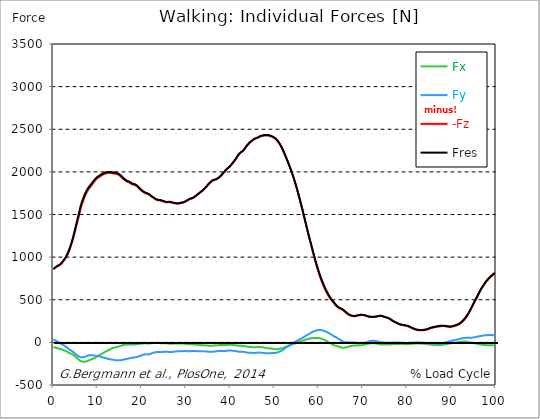
| Category |  Fx |  Fy |  -Fz |  Fres |
|---|---|---|---|---|
| 0.0 | -53.86 | 35.7 | 858.32 | 861.93 |
| 0.1647276845464841 | -56.61 | 30.84 | 865.24 | 868.71 |
| 0.3294553690929682 | -59.45 | 26.04 | 871.29 | 874.8 |
| 0.5044785339236075 | -62.16 | 21.47 | 878.05 | 881.61 |
| 0.6692062184700917 | -64.8 | 17 | 885.11 | 888.73 |
| 0.8339339030165757 | -67.29 | 11.73 | 890.66 | 894.36 |
| 0.9986615875630598 | -69.61 | 6.05 | 896.05 | 899.89 |
| 1.1633892721095438 | -71.93 | 0.19 | 900.86 | 904.81 |
| 1.3384124369401833 | -73.68 | -4.69 | 904.4 | 908.5 |
| 1.5031401214866673 | -75.67 | -9.22 | 909.85 | 914.18 |
| 1.6678678060331513 | -77.93 | -14.22 | 916.52 | 921.11 |
| 1.8325954905796356 | -80.8 | -19.09 | 924.65 | 929.49 |
| 1.9973231751261196 | -84.22 | -23.05 | 935.83 | 940.97 |
| 2.1620508596726036 | -88.34 | -27.77 | 947.15 | 952.63 |
| 2.337074024503243 | -92.35 | -33.05 | 958.51 | 964.37 |
| 2.501801709049727 | -96.06 | -38.92 | 970.1 | 976.39 |
| 2.666529393596211 | -99.51 | -45.11 | 981.97 | 988.69 |
| 2.8312570781426953 | -103.22 | -51.71 | 995.38 | 1002.7 |
| 2.9959847626891793 | -107 | -58.41 | 1009.56 | 1017.52 |
| 3.1710079275198186 | -111.03 | -65.02 | 1026.88 | 1035.52 |
| 3.3357356120663026 | -115.9 | -72.35 | 1047.24 | 1056.63 |
| 3.500463296612787 | -121.27 | -80.82 | 1067.57 | 1077.87 |
| 3.665190981159271 | -125.32 | -86.28 | 1091.03 | 1101.96 |
| 3.8299186657057547 | -128.54 | -90.71 | 1115.15 | 1126.6 |
| 4.004941830536394 | -131.88 | -95.23 | 1140.01 | 1152 |
| 4.169669515082878 | -135.39 | -99.82 | 1165.99 | 1178.53 |
| 4.334397199629363 | -140.22 | -106.33 | 1195.18 | 1208.54 |
| 4.499124884175846 | -146.07 | -114.11 | 1226.6 | 1241 |
| 4.663852568722331 | -153.48 | -122.36 | 1259.73 | 1275.43 |
| 4.8285802532688145 | -160.64 | -129.9 | 1293.23 | 1310.11 |
| 5.003603418099454 | -168.5 | -137.03 | 1328.29 | 1346.44 |
| 5.168331102645938 | -177.04 | -144.72 | 1363.5 | 1383.03 |
| 5.333058787192422 | -184.18 | -150.55 | 1396.71 | 1417.29 |
| 5.497786471738906 | -191.23 | -155.72 | 1429.99 | 1451.57 |
| 5.662514156285391 | -198.05 | -160.57 | 1463.15 | 1485.66 |
| 5.83753732111603 | -205.17 | -165.88 | 1497.69 | 1521.19 |
| 6.0022650056625135 | -213.39 | -171.7 | 1537.04 | 1561.61 |
| 6.166992690208998 | -219.92 | -175.82 | 1572.26 | 1597.65 |
| 6.331720374755482 | -223.09 | -176.34 | 1601.04 | 1626.51 |
| 6.496448059301967 | -225.51 | -175.91 | 1627.23 | 1652.61 |
| 6.671471224132605 | -226.65 | -174.37 | 1651.07 | 1676.18 |
| 6.836198908679089 | -227.15 | -172.96 | 1675 | 1699.7 |
| 7.000926593225574 | -227.78 | -171.74 | 1699.38 | 1723.71 |
| 7.165654277772057 | -227.07 | -169.28 | 1720.34 | 1744.04 |
| 7.330381962318542 | -224.96 | -165.61 | 1738.13 | 1760.97 |
| 7.495109646865026 | -221.86 | -160.8 | 1755.15 | 1776.93 |
| 7.670132811695664 | -218.85 | -156.48 | 1771.79 | 1792.59 |
| 7.8348604962421495 | -216.13 | -153.73 | 1787.13 | 1807.22 |
| 7.999588180788634 | -212.69 | -152.15 | 1800.79 | 1820.23 |
| 8.164315865335118 | -208.76 | -151.47 | 1812.64 | 1831.5 |
| 8.329043549881602 | -204.94 | -150.82 | 1822.72 | 1841.04 |
| 8.504066714712243 | -201.36 | -150.86 | 1833.21 | 1851.08 |
| 8.668794399258726 | -197.91 | -151.55 | 1844.83 | 1862.31 |
| 8.833522083805208 | -194.22 | -151.83 | 1857.53 | 1874.52 |
| 8.998249768351693 | -190.71 | -153.18 | 1870.16 | 1886.78 |
| 9.162977452898177 | -187.16 | -154.67 | 1882.15 | 1898.44 |
| 9.338000617728817 | -183.28 | -155.65 | 1893.23 | 1909.13 |
| 9.5027283022753 | -179.01 | -156.24 | 1903.3 | 1918.76 |
| 9.667455986821786 | -174.47 | -157.31 | 1912.75 | 1927.81 |
| 9.83218367136827 | -169.15 | -158.36 | 1920.73 | 1935.36 |
| 9.996911355914754 | -163.6 | -159.59 | 1927.75 | 1941.98 |
| 10.171934520745392 | -158 | -161 | 1934.03 | 1947.91 |
| 10.336662205291876 | -152.45 | -162.64 | 1940.13 | 1953.68 |
| 10.501389889838359 | -147 | -164.57 | 1946.15 | 1959.39 |
| 10.666117574384844 | -141.86 | -167.35 | 1951.88 | 1964.93 |
| 10.830845258931328 | -136.86 | -170.53 | 1957.3 | 1970.22 |
| 10.995572943477812 | -131.8 | -173.43 | 1962.37 | 1975.15 |
| 11.170596108308452 | -126.73 | -176.07 | 1967.22 | 1979.86 |
| 11.335323792854936 | -121.64 | -178.5 | 1972.03 | 1984.51 |
| 11.50005147740142 | -116.83 | -180.47 | 1975.85 | 1988.19 |
| 11.664779161947905 | -112.39 | -182.82 | 1979.1 | 1991.36 |
| 11.829506846494388 | -108.1 | -185.56 | 1982.27 | 1994.5 |
| 12.004530011325027 | -103.84 | -188.52 | 1984.29 | 1996.56 |
| 12.169257695871512 | -99.21 | -191.12 | 1985.66 | 1997.92 |
| 12.333985380417996 | -94.62 | -193.51 | 1986.71 | 1998.95 |
| 12.498713064964479 | -89.83 | -195.63 | 1987.39 | 1999.58 |
| 12.663440749510965 | -85.07 | -197.51 | 1987.69 | 1999.8 |
| 12.838463914341604 | -80.75 | -198.87 | 1987.41 | 1999.45 |
| 13.003191598888087 | -76.7 | -199.73 | 1986.49 | 1998.43 |
| 13.167919283434573 | -72.71 | -201.24 | 1984.9 | 1996.83 |
| 13.332646967981058 | -68.95 | -201.9 | 1983.16 | 1995.01 |
| 13.497374652527538 | -65.56 | -203.42 | 1981.61 | 1993.5 |
| 13.662102337074025 | -63.18 | -205.41 | 1980.59 | 1992.6 |
| 13.837125501904662 | -61.22 | -207.39 | 1980.16 | 1992.3 |
| 14.001853186451148 | -59.41 | -208.13 | 1978.93 | 1991.11 |
| 14.166580870997631 | -57.5 | -208.8 | 1977.45 | 1989.64 |
| 14.331308555544114 | -55.1 | -209.53 | 1975.12 | 1987.33 |
| 14.4960362400906 | -53.1 | -209.02 | 1972.05 | 1984.16 |
| 14.671059404921238 | -51.17 | -209.53 | 1968.25 | 1980.38 |
| 14.835787089467724 | -47.49 | -209.74 | 1962.68 | 1974.74 |
| 15.000514774014206 | -43.6 | -209.88 | 1956.8 | 1968.79 |
| 15.165242458560689 | -41.46 | -209.39 | 1949.6 | 1961.53 |
| 15.329970143107175 | -39.32 | -208.89 | 1942.39 | 1954.26 |
| 15.504993307937815 | -36.43 | -207.26 | 1933.21 | 1944.9 |
| 15.669720992484299 | -33.69 | -205.46 | 1924.17 | 1935.66 |
| 15.834448677030782 | -31.39 | -202.92 | 1916.23 | 1927.44 |
| 15.999176361577268 | -29.3 | -200 | 1909.02 | 1919.93 |
| 16.16390404612375 | -26.81 | -197.85 | 1902.15 | 1912.83 |
| 16.33892721095439 | -25.21 | -196 | 1895.86 | 1906.36 |
| 16.503654895500876 | -24.72 | -194.4 | 1890.03 | 1900.39 |
| 16.668382580047357 | -24.73 | -193.09 | 1885.36 | 1895.62 |
| 16.833110264593845 | -24.65 | -191.17 | 1881.86 | 1891.96 |
| 16.997837949140326 | -24.86 | -189.24 | 1879.01 | 1888.95 |
| 17.16256563368681 | -25.05 | -187.39 | 1875.79 | 1885.58 |
| 17.33758879851745 | -24.94 | -185.65 | 1870.94 | 1880.57 |
| 17.502316483063932 | -24.71 | -183.32 | 1865.05 | 1874.49 |
| 17.667044167610417 | -23.69 | -181.28 | 1858.94 | 1868.2 |
| 17.8317718521569 | -23.12 | -179.75 | 1855 | 1864.11 |
| 17.996499536703386 | -23.68 | -178.2 | 1851.98 | 1860.96 |
| 18.171522701534023 | -24.38 | -177.68 | 1849.91 | 1858.87 |
| 18.33625038608051 | -25.09 | -177.67 | 1848.45 | 1857.44 |
| 18.500978070626992 | -24.66 | -175.68 | 1844.03 | 1852.85 |
| 18.665705755173477 | -23.99 | -173.58 | 1839.32 | 1847.96 |
| 18.83043343971996 | -22.67 | -171.86 | 1834.39 | 1842.86 |
| 19.0054566045506 | -21.89 | -169.52 | 1827.23 | 1835.52 |
| 19.170184289097087 | -20.77 | -166.86 | 1818.76 | 1826.83 |
| 19.33491197364357 | -19.51 | -163.8 | 1809.88 | 1817.7 |
| 19.499639658190056 | -17.47 | -159.8 | 1800.48 | 1807.95 |
| 19.66436734273654 | -15.77 | -156.21 | 1791.78 | 1798.94 |
| 19.82909502728302 | -14.68 | -153.03 | 1783.9 | 1790.8 |
| 20.004118192113662 | -13.92 | -150.1 | 1777.02 | 1783.67 |
| 20.168845876660146 | -12.97 | -146.98 | 1770.52 | 1776.91 |
| 20.33357356120663 | -12.24 | -144.01 | 1764.62 | 1770.78 |
| 20.49830124575311 | -11.45 | -141.68 | 1759.63 | 1765.61 |
| 20.663028930299596 | -10.84 | -140.26 | 1754.88 | 1760.74 |
| 20.838052095130234 | -10.45 | -140.13 | 1750.34 | 1756.19 |
| 21.002779779676718 | -11.26 | -140.38 | 1746.88 | 1752.76 |
| 21.167507464223206 | -12.28 | -140.88 | 1743.62 | 1749.57 |
| 21.332235148769687 | -13.31 | -141.55 | 1740.51 | 1746.52 |
| 21.496962833316175 | -13.79 | -141.1 | 1736.62 | 1742.61 |
| 21.671985998146813 | -13.76 | -139.79 | 1731.83 | 1737.72 |
| 21.836713682693297 | -13.04 | -137.55 | 1725.78 | 1731.51 |
| 22.00144136723978 | -11.92 | -134.29 | 1718.89 | 1724.37 |
| 22.166169051786262 | -10.13 | -129.73 | 1711.51 | 1716.64 |
| 22.33089673633275 | -8.84 | -125.72 | 1704.84 | 1709.66 |
| 22.505919901163388 | -8.79 | -123.1 | 1699.88 | 1704.53 |
| 22.670647585709872 | -8.18 | -121.14 | 1694.7 | 1699.22 |
| 22.835375270256357 | -7.21 | -119.09 | 1689.11 | 1693.5 |
| 23.00010295480284 | -6 | -116.81 | 1683.05 | 1687.31 |
| 23.164830639349326 | -5.29 | -114.41 | 1676.93 | 1681.06 |
| 23.32955832389581 | -5.31 | -113.47 | 1673.13 | 1677.2 |
| 23.50458148872645 | -5.68 | -112.96 | 1670.35 | 1674.4 |
| 23.66930917327293 | -6.39 | -112.92 | 1668.71 | 1672.76 |
| 23.834036857819417 | -7.25 | -113.05 | 1667.31 | 1671.38 |
| 23.998764542365898 | -8.37 | -113.21 | 1666.1 | 1670.19 |
| 24.163492226912382 | -9.32 | -113.39 | 1664.74 | 1668.85 |
| 24.338515391743023 | -10.11 | -113.56 | 1663.51 | 1667.63 |
| 24.503243076289504 | -10.2 | -113.14 | 1660.93 | 1665.03 |
| 24.667970760835992 | -10.18 | -112.36 | 1657.74 | 1661.79 |
| 24.832698445382476 | -10.23 | -111.69 | 1654.91 | 1658.92 |
| 24.997426129928957 | -9.83 | -110.47 | 1651.13 | 1655.06 |
| 25.1724492947596 | -9.91 | -109.69 | 1648.37 | 1652.26 |
| 25.337176979306086 | -10.27 | -109.39 | 1646.22 | 1650.09 |
| 25.501904663852567 | -10.67 | -109.26 | 1644.22 | 1648.08 |
| 25.66663234839905 | -11.46 | -109.62 | 1643.58 | 1647.48 |
| 25.831360032945536 | -12.53 | -110.58 | 1643.63 | 1647.6 |
| 25.99608771749202 | -13.79 | -111.94 | 1644.19 | 1648.26 |
| 26.171110882322658 | -15.08 | -113.41 | 1644.95 | 1649.13 |
| 26.335838566869146 | -15.96 | -114.17 | 1644.95 | 1649.19 |
| 26.50056625141563 | -16.05 | -113.85 | 1643.61 | 1647.83 |
| 26.665293935962115 | -15.8 | -113.13 | 1641.61 | 1645.77 |
| 26.830021620508592 | -15.31 | -112.29 | 1639.44 | 1643.55 |
| 27.00504478533923 | -14.46 | -111.1 | 1636.98 | 1641 |
| 27.169772469885718 | -13.8 | -109.61 | 1634.54 | 1638.46 |
| 27.334500154432202 | -13.64 | -108.55 | 1632.53 | 1636.4 |
| 27.499227838978687 | -13.29 | -107.51 | 1630.72 | 1634.53 |
| 27.66395552352517 | -12.96 | -106.37 | 1629.67 | 1633.41 |
| 27.83897868835581 | -13.1 | -105.99 | 1629.2 | 1632.92 |
| 28.003706372902297 | -12.7 | -105.12 | 1628.06 | 1631.73 |
| 28.168434057448778 | -12.41 | -104.42 | 1627.48 | 1631.1 |
| 28.333161741995262 | -12.44 | -103.96 | 1628.06 | 1631.65 |
| 28.497889426541747 | -12.59 | -103.46 | 1629.47 | 1633.02 |
| 28.662617111088228 | -13.12 | -103.83 | 1631.95 | 1635.52 |
| 28.837640275918872 | -13.66 | -104.2 | 1634.42 | 1638.01 |
| 29.002367960465357 | -13.83 | -103.71 | 1636.2 | 1639.76 |
| 29.167095645011837 | -13.87 | -102.91 | 1637.86 | 1641.36 |
| 29.331823329558322 | -13.82 | -101.8 | 1639.54 | 1642.98 |
| 29.496551014104806 | -14.99 | -102.21 | 1642.98 | 1646.45 |
| 29.671574178935447 | -15.69 | -102.27 | 1646.76 | 1650.23 |
| 29.836301863481932 | -16.5 | -102.37 | 1650.78 | 1654.25 |
| 30.001029548028413 | -17.59 | -102.6 | 1655.44 | 1658.92 |
| 30.165757232574894 | -18.5 | -102.79 | 1659.73 | 1663.22 |
| 30.330484917121378 | -19.77 | -103.47 | 1665.18 | 1668.72 |
| 30.505508081952023 | -21.3 | -104.36 | 1671.43 | 1675.05 |
| 30.670235766498504 | -22.66 | -105.02 | 1677.46 | 1681.14 |
| 30.834963451044988 | -23.43 | -105.12 | 1681.36 | 1685.06 |
| 30.999691135591473 | -23.13 | -104.01 | 1683.49 | 1687.12 |
| 31.16441882013796 | -22.59 | -102.74 | 1685.22 | 1688.74 |
| 31.339441984968598 | -22.45 | -101.91 | 1688.2 | 1691.67 |
| 31.50416966951508 | -23 | -101.65 | 1692.34 | 1695.79 |
| 31.668897354061563 | -23.45 | -101.79 | 1696.95 | 1700.41 |
| 31.833625038608048 | -23.98 | -101.72 | 1702.47 | 1705.94 |
| 31.998352723154536 | -24.71 | -101.75 | 1708.51 | 1711.99 |
| 32.16308040770102 | -25.45 | -102.15 | 1714.81 | 1718.32 |
| 32.33810357253166 | -26.2 | -102.56 | 1721.05 | 1724.59 |
| 32.502831257078135 | -27.12 | -102.93 | 1727.9 | 1731.46 |
| 32.66755894162463 | -28.41 | -103.54 | 1735.2 | 1738.82 |
| 32.83228662617111 | -29.73 | -104.14 | 1742.52 | 1746.19 |
| 32.99701431071759 | -30.99 | -104.6 | 1749.38 | 1753.1 |
| 33.17203747554823 | -32.09 | -104.9 | 1756.41 | 1760.16 |
| 33.336765160094714 | -32.86 | -105.14 | 1762.84 | 1766.61 |
| 33.5014928446412 | -33.41 | -105.36 | 1768.95 | 1772.74 |
| 33.66622052918769 | -33.64 | -105.29 | 1776.18 | 1779.96 |
| 33.83094821373417 | -33.85 | -105.18 | 1784.03 | 1787.79 |
| 34.00597137856481 | -34.21 | -105.28 | 1792.27 | 1796.04 |
| 34.17069906311129 | -34.73 | -105.54 | 1800.85 | 1804.63 |
| 34.33542674765778 | -35.4 | -105.72 | 1809.44 | 1813.23 |
| 34.50015443220426 | -36 | -106.28 | 1818.44 | 1822.25 |
| 34.664882116750746 | -36.86 | -107.42 | 1828.97 | 1832.83 |
| 34.829609801297224 | -37.77 | -108.58 | 1840.02 | 1843.92 |
| 35.004632966127865 | -38.31 | -109.2 | 1849.52 | 1853.43 |
| 35.169360650674356 | -38.76 | -109.72 | 1858.23 | 1862.15 |
| 35.334088335220834 | -39.01 | -109.96 | 1867.34 | 1871.27 |
| 35.49881601976732 | -39.32 | -109.96 | 1876.22 | 1880.13 |
| 35.6635437043138 | -39.39 | -109.81 | 1884.11 | 1887.98 |
| 35.838566869144444 | -39.3 | -109.64 | 1890.86 | 1894.71 |
| 36.00329455369093 | -38.99 | -109.56 | 1897.1 | 1900.91 |
| 36.16802223823741 | -37.91 | -108.46 | 1901.3 | 1905.02 |
| 36.3327499227839 | -36.57 | -107.21 | 1904.08 | 1907.69 |
| 36.497477607330374 | -35.2 | -106.21 | 1905.79 | 1909.32 |
| 36.67250077216102 | -34.51 | -105.65 | 1909.15 | 1912.63 |
| 36.83722845670751 | -33.76 | -104.68 | 1912.55 | 1915.97 |
| 37.001956141253984 | -33.06 | -103.37 | 1916.7 | 1920.04 |
| 37.166683825800476 | -32.63 | -102.35 | 1922.55 | 1925.84 |
| 37.33141151034695 | -32.58 | -101.63 | 1928.13 | 1931.37 |
| 37.496139194893445 | -32.05 | -100.86 | 1934.8 | 1937.97 |
| 37.671162359724086 | -31.51 | -100.31 | 1942.33 | 1945.46 |
| 37.83589004427056 | -31.16 | -100.16 | 1951.13 | 1954.23 |
| 38.00061772881704 | -31 | -99.84 | 1960.06 | 1963.14 |
| 38.16534541336353 | -30.9 | -99.67 | 1969.4 | 1972.48 |
| 38.33007309791002 | -31.23 | -99.86 | 1979.7 | 1982.79 |
| 38.50509626274065 | -31.67 | -100.05 | 1990.01 | 1993.1 |
| 38.66982394728714 | -31.76 | -100.01 | 1999.79 | 2002.86 |
| 38.83455163183362 | -31.78 | -99.98 | 2009.56 | 2012.6 |
| 38.99927931638011 | -31.68 | -99.76 | 2019.45 | 2022.46 |
| 39.16400700092659 | -31.32 | -99.26 | 2029.06 | 2032.02 |
| 39.33903016575723 | -30.09 | -98.22 | 2036.98 | 2039.9 |
| 39.503757850303714 | -28.75 | -96.84 | 2044.03 | 2046.87 |
| 39.6684855348502 | -27.55 | -95.41 | 2051.05 | 2053.8 |
| 39.83321321939669 | -27.38 | -94.97 | 2059.23 | 2061.93 |
| 39.99794090394317 | -27.76 | -95.1 | 2068.1 | 2070.78 |
| 40.1729640687738 | -28.6 | -95.96 | 2078.2 | 2080.92 |
| 40.33769175332029 | -29.33 | -96.47 | 2088.42 | 2091.15 |
| 40.50241943786678 | -30.36 | -97.62 | 2099.42 | 2102.19 |
| 40.66714712241326 | -31.23 | -98.73 | 2110.46 | 2113.28 |
| 40.831874806959746 | -32.1 | -99.74 | 2121.54 | 2124.41 |
| 40.99660249150622 | -32.64 | -100.2 | 2132.31 | 2135.19 |
| 41.17162565633686 | -33.77 | -101.66 | 2144.07 | 2147.03 |
| 41.336353340883356 | -35.05 | -103.35 | 2156.86 | 2159.89 |
| 41.50108102542983 | -36.19 | -105.18 | 2170.84 | 2173.96 |
| 41.66580870997632 | -37.33 | -107.04 | 2184.89 | 2188.09 |
| 41.8305363945228 | -38.26 | -108.45 | 2197.22 | 2200.49 |
| 42.005559559353436 | -39.08 | -109.61 | 2208.43 | 2211.75 |
| 42.17028724389993 | -40.06 | -110.67 | 2216.94 | 2220.3 |
| 42.33501492844641 | -40.71 | -111.17 | 2224.75 | 2228.13 |
| 42.4997426129929 | -40.67 | -110.99 | 2231.36 | 2234.73 |
| 42.664470297539374 | -40.48 | -110.67 | 2237.54 | 2240.88 |
| 42.839493462370015 | -40.51 | -110.37 | 2243.73 | 2247.06 |
| 43.00422114691651 | -41.99 | -111.83 | 2253.09 | 2256.5 |
| 43.168948831462984 | -43.45 | -113.27 | 2262.98 | 2266.48 |
| 43.33367651600947 | -44.97 | -114.72 | 2273.87 | 2277.46 |
| 43.49840420055595 | -46.72 | -116.6 | 2286.01 | 2289.72 |
| 43.66313188510244 | -48.54 | -118.54 | 2299.07 | 2302.9 |
| 43.83815504993308 | -50.14 | -119.91 | 2309.89 | 2313.81 |
| 44.00288273447956 | -51.76 | -120.92 | 2319.93 | 2323.93 |
| 44.16761041902604 | -53.32 | -121.93 | 2329.65 | 2333.73 |
| 44.332338103572525 | -54.3 | -122.79 | 2338.52 | 2342.65 |
| 44.49706578811901 | -54.71 | -123.09 | 2346.28 | 2350.42 |
| 44.67208895294965 | -54.96 | -122.99 | 2353.37 | 2357.5 |
| 44.836816637496135 | -55.34 | -122.83 | 2360.35 | 2364.46 |
| 45.00154432204262 | -55.88 | -122.9 | 2367.37 | 2371.5 |
| 45.166272006589104 | -56.67 | -123.43 | 2373.92 | 2378.1 |
| 45.33099969113559 | -57.36 | -123.89 | 2379.96 | 2384.18 |
| 45.50602285596623 | -57.38 | -123.68 | 2384.86 | 2389.07 |
| 45.670750540512714 | -56.78 | -122.91 | 2389.17 | 2393.33 |
| 45.83547822505919 | -55.92 | -122.02 | 2393.32 | 2397.41 |
| 46.00020590960568 | -54.85 | -121.16 | 2396.64 | 2400.64 |
| 46.16493359415217 | -53.32 | -119.91 | 2398.93 | 2402.83 |
| 46.3399567589828 | -52.72 | -119.6 | 2402.71 | 2406.56 |
| 46.50468444352929 | -52.42 | -119.45 | 2407.66 | 2411.48 |
| 46.66941212807577 | -53.19 | -119.9 | 2412.55 | 2416.42 |
| 46.83413981262226 | -54.63 | -121.07 | 2416.5 | 2420.47 |
| 46.99886749716874 | -55.32 | -121.65 | 2419.43 | 2423.43 |
| 47.16359518171523 | -56.16 | -122.09 | 2421.88 | 2425.9 |
| 47.33861834654586 | -57.87 | -123.01 | 2423.91 | 2428 |
| 47.50334603109235 | -59.98 | -124.4 | 2425.54 | 2429.72 |
| 47.66807371563883 | -61.98 | -125.61 | 2426.59 | 2430.85 |
| 47.83280140018532 | -63.86 | -126.68 | 2427.58 | 2431.91 |
| 47.997529084731795 | -65.02 | -126.84 | 2428.09 | 2432.46 |
| 48.172552249562436 | -65.68 | -126.28 | 2427.77 | 2432.14 |
| 48.33727993410892 | -66.95 | -126.26 | 2427.2 | 2431.59 |
| 48.502007618655405 | -68.74 | -126.79 | 2427.42 | 2431.86 |
| 48.6667353032019 | -69.76 | -126.84 | 2425.73 | 2430.2 |
| 48.831462987748374 | -70.7 | -126.76 | 2423.64 | 2428.13 |
| 49.00648615257901 | -71.65 | -126.67 | 2421.55 | 2426.05 |
| 49.17121383712551 | -72.8 | -126.73 | 2418.94 | 2423.48 |
| 49.335941521671984 | -73.49 | -125.92 | 2414.78 | 2419.3 |
| 49.50066920621847 | -74.28 | -124.87 | 2409.7 | 2414.2 |
| 49.66539689076495 | -75.73 | -124.57 | 2405.46 | 2409.99 |
| 49.83012457531144 | -77.56 | -124.88 | 2401.99 | 2406.59 |
| 50.00514774014208 | -78.65 | -124.51 | 2396.85 | 2401.48 |
| 50.16987542468856 | -79.41 | -123.71 | 2390.42 | 2395.04 |
| 50.33460310923505 | -79.8 | -122.29 | 2382.68 | 2387.25 |
| 50.499330793781525 | -79.86 | -120.49 | 2373.97 | 2378.48 |
| 50.66405847832801 | -79.41 | -118.23 | 2364.05 | 2368.46 |
| 50.83908164315865 | -78.54 | -115.41 | 2353.48 | 2357.76 |
| 51.003809327705135 | -77.09 | -111.72 | 2340.44 | 2344.53 |
| 51.16853701225162 | -75.13 | -107.52 | 2326.72 | 2330.6 |
| 51.3332646967981 | -73.12 | -103.28 | 2312.5 | 2316.16 |
| 51.49799238134458 | -71.39 | -99.3 | 2297.65 | 2301.11 |
| 51.67301554617522 | -69.14 | -94.5 | 2281.01 | 2284.25 |
| 51.837743230721706 | -65.99 | -88.55 | 2262.87 | 2265.82 |
| 52.00247091526819 | -63.2 | -83.16 | 2244.27 | 2246.98 |
| 52.16719859981468 | -59.84 | -77.25 | 2225.01 | 2227.44 |
| 52.33192628436116 | -56.49 | -71.3 | 2204.84 | 2207.01 |
| 52.5069494491918 | -53.22 | -65.45 | 2183.47 | 2185.39 |
| 52.67167713373829 | -49.88 | -59.44 | 2162.06 | 2163.74 |
| 52.83640481828477 | -46.52 | -53.45 | 2140.62 | 2142.06 |
| 53.00113250283126 | -43.2 | -47.38 | 2119.24 | 2120.47 |
| 53.16586018737774 | -40.1 | -41.74 | 2097.64 | 2098.68 |
| 53.33058787192423 | -37.13 | -36.04 | 2075.51 | 2076.42 |
| 53.50561103675487 | -33.73 | -30.03 | 2052.82 | 2053.59 |
| 53.67033872130134 | -30.7 | -24.67 | 2028.88 | 2029.59 |
| 53.83506640584783 | -27.8 | -19.42 | 2004.84 | 2005.47 |
| 53.99979409039431 | -25.06 | -14.25 | 1980.54 | 1981.1 |
| 54.164521774940795 | -21.91 | -8.89 | 1954.92 | 1955.42 |
| 54.339544939771436 | -18.74 | -3.43 | 1928 | 1928.46 |
| 54.50427262431792 | -15.76 | 1.74 | 1900.7 | 1901.13 |
| 54.669000308864405 | -12.79 | 6.66 | 1872.53 | 1872.94 |
| 54.83372799341089 | -9.73 | 11.52 | 1843.6 | 1844.02 |
| 54.998455677957374 | -6.61 | 16.39 | 1814.12 | 1814.56 |
| 55.173478842788015 | -3.55 | 21.05 | 1784.03 | 1784.51 |
| 55.3382065273345 | -0.4 | 25.41 | 1752.79 | 1753.34 |
| 55.502934211880984 | 2.73 | 30.07 | 1720.63 | 1721.26 |
| 55.66766189642746 | 6.07 | 34.63 | 1687.72 | 1688.44 |
| 55.83238958097395 | 9.3 | 39.07 | 1654.1 | 1654.95 |
| 55.997117265520444 | 12.48 | 43.55 | 1620.52 | 1621.53 |
| 56.17214043035107 | 15.72 | 48.29 | 1586.27 | 1587.46 |
| 56.336868114897555 | 18.98 | 53.09 | 1551.43 | 1552.83 |
| 56.50159579944404 | 22.18 | 58 | 1516.09 | 1517.74 |
| 56.666323483990524 | 25.37 | 63.08 | 1480.45 | 1482.43 |
| 56.83105116853701 | 28.66 | 68.35 | 1445.01 | 1447.31 |
| 57.00607433336764 | 31.78 | 73.52 | 1409.78 | 1412.43 |
| 57.170802017914134 | 34.69 | 78.92 | 1373.84 | 1376.99 |
| 57.33552970246061 | 37.36 | 84.41 | 1337.8 | 1341.45 |
| 57.5002573870071 | 39.86 | 89.79 | 1301.85 | 1306.06 |
| 57.66498507155359 | 42.17 | 94.98 | 1266.63 | 1271.39 |
| 57.84000823638422 | 44.29 | 100.3 | 1232.22 | 1237.61 |
| 58.00473592093071 | 45.94 | 105.36 | 1198.49 | 1204.57 |
| 58.16946360547718 | 47.25 | 110.12 | 1165.35 | 1172.12 |
| 58.334191290023675 | 48.41 | 114.66 | 1132.14 | 1139.6 |
| 58.49891897457017 | 49.58 | 119.27 | 1098.33 | 1106.57 |
| 58.663646659116644 | 50.63 | 123.67 | 1064.69 | 1073.71 |
| 58.838669823947285 | 51.48 | 127.83 | 1031.36 | 1041.17 |
| 59.00339750849377 | 52.01 | 131.53 | 998.45 | 1009.09 |
| 59.168125193040254 | 52.34 | 134.85 | 965.92 | 977.38 |
| 59.33285287758674 | 52.34 | 137.56 | 934.33 | 946.52 |
| 59.49758056213322 | 51.99 | 139.68 | 903.92 | 916.8 |
| 59.672603726963864 | 51.73 | 141.88 | 874.33 | 887.91 |
| 59.83733141151035 | 51.17 | 143.46 | 845.15 | 859.41 |
| 60.002059096056826 | 50.28 | 144.62 | 817.46 | 832.29 |
| 60.16678678060332 | 49.42 | 145.85 | 790.58 | 806 |
| 60.33151446514979 | 48.11 | 146.3 | 764.86 | 780.69 |
| 60.506537629980436 | 45.6 | 145.32 | 741.21 | 757.17 |
| 60.67126531452693 | 42.42 | 143.35 | 718.71 | 734.58 |
| 60.8359929990734 | 39.3 | 141.61 | 696.67 | 712.5 |
| 61.00072068361989 | 35.67 | 139.04 | 675.54 | 691.16 |
| 61.165448368166366 | 32.07 | 136.43 | 654.98 | 670.39 |
| 61.34047153299701 | 28.13 | 133.21 | 635.07 | 650.13 |
| 61.5051992175435 | 23.89 | 129.77 | 616.3 | 630.94 |
| 61.669926902089976 | 19.11 | 125.89 | 598.71 | 612.78 |
| 61.83465458663647 | 14.07 | 121.8 | 581.76 | 595.26 |
| 61.999382271182945 | 8.98 | 117.19 | 565.88 | 578.84 |
| 62.16410995572944 | 4.15 | 112.65 | 551.04 | 563.44 |
| 62.33913312056008 | -0.92 | 107.68 | 536.57 | 548.38 |
| 62.50386080510655 | -6.02 | 102.3 | 523 | 534.13 |
| 62.66858848965305 | -10.87 | 97.31 | 509.75 | 520.33 |
| 62.83331617419952 | -15.14 | 92.15 | 498.44 | 508.59 |
| 62.998043858746 | -20.17 | 86.22 | 488.11 | 497.62 |
| 63.17306702357666 | -25.6 | 80.03 | 478.4 | 487.42 |
| 63.33779470812313 | -30.55 | 74.32 | 468.37 | 477.02 |
| 63.50252239266961 | -34.2 | 69.7 | 457.42 | 465.74 |
| 63.667250077216096 | -36.62 | 65.76 | 446.41 | 454.51 |
| 63.83197776176258 | -39.61 | 61.6 | 435.81 | 443.67 |
| 64.00700092659322 | -41.41 | 57.61 | 426.06 | 433.65 |
| 64.1717286111397 | -43.56 | 53.09 | 417.85 | 425.07 |
| 64.33645629568619 | -46.71 | 47.83 | 411.15 | 418.05 |
| 64.50118398023267 | -49.64 | 42.45 | 405.25 | 412 |
| 64.66591166477916 | -52.12 | 37.3 | 399.87 | 406.57 |
| 64.83063934932565 | -55.18 | 31.8 | 395.17 | 401.82 |
| 65.00566251415627 | -58.25 | 25.71 | 390.81 | 397.49 |
| 65.17039019870276 | -61.33 | 19.3 | 387.25 | 393.84 |
| 65.33511788324925 | -63.91 | 13.11 | 383.64 | 390.11 |
| 65.49984556779573 | -64.23 | 8.74 | 377.93 | 384.46 |
| 65.66457325234222 | -63.48 | 5.41 | 371.28 | 377.76 |
| 65.83959641717286 | -61.92 | 3.29 | 363.74 | 370.03 |
| 66.00432410171935 | -60.09 | 1.43 | 356.09 | 362.22 |
| 66.16905178626584 | -58.15 | -0.36 | 348.46 | 354.39 |
| 66.3337794708123 | -55.91 | -1.48 | 341.47 | 347.05 |
| 66.4985071553588 | -53.27 | -1.73 | 334.79 | 339.95 |
| 66.67353032018943 | -50.91 | -2.08 | 328.71 | 333.49 |
| 66.83825800473592 | -48.82 | -2.43 | 323.39 | 327.81 |
| 67.0029856892824 | -47.17 | -2.93 | 319.28 | 323.4 |
| 67.16771337382887 | -45.5 | -3.21 | 315.7 | 319.54 |
| 67.33244105837538 | -42.61 | -1.54 | 312.12 | 315.53 |
| 67.49716874292186 | -40.71 | -1.09 | 310.27 | 313.42 |
| 67.67219190775249 | -39.23 | -1.03 | 308.8 | 311.76 |
| 67.83691959229898 | -37.94 | -0.91 | 307.9 | 310.71 |
| 68.00164727684546 | -37.03 | -1.35 | 307.33 | 309.99 |
| 68.16637496139195 | -36.39 | -2.12 | 307.21 | 309.77 |
| 68.33110264593842 | -36.11 | -3.38 | 308.65 | 311.22 |
| 68.50612581076906 | -35.79 | -4.49 | 310.72 | 313.27 |
| 68.67085349531555 | -35.5 | -5.28 | 313 | 315.54 |
| 68.83558117986203 | -35.2 | -6.31 | 315.5 | 318.02 |
| 69.00030886440852 | -35 | -7.14 | 317.31 | 319.82 |
| 69.165036548955 | -34.65 | -7.62 | 318.58 | 321.1 |
| 69.34005971378564 | -33.95 | -7.32 | 319.84 | 322.3 |
| 69.50478739833213 | -33.81 | -7.84 | 321.34 | 323.81 |
| 69.66951508287862 | -33.37 | -8.13 | 322.22 | 324.66 |
| 69.8342427674251 | -32.17 | -7.94 | 321.61 | 323.93 |
| 69.99897045197157 | -30.64 | -6.97 | 320.56 | 322.7 |
| 70.17399361680222 | -29.01 | -5.62 | 319.11 | 321.09 |
| 70.33872130134871 | -27.14 | -4.02 | 317.34 | 319.14 |
| 70.50344898589518 | -25.05 | -2.16 | 315.38 | 317 |
| 70.66817667044167 | -22.94 | 0.25 | 312.87 | 314.36 |
| 70.83290435498816 | -20.73 | 2.56 | 310.22 | 311.6 |
| 70.99763203953464 | -18.31 | 5.43 | 306.95 | 308.35 |
| 71.17265520436527 | -16.1 | 8.02 | 304.39 | 305.74 |
| 71.33738288891176 | -14.16 | 10.53 | 302.23 | 303.55 |
| 71.50211057345825 | -12.52 | 12.94 | 300.4 | 301.74 |
| 71.66683825800473 | -10.89 | 15.22 | 298.81 | 300.12 |
| 71.83156594255121 | -10.06 | 16.63 | 298.19 | 299.48 |
| 72.00658910738186 | -9.39 | 17.53 | 297.88 | 299.2 |
| 72.17131679192833 | -9.47 | 17.78 | 297.97 | 299.29 |
| 72.33604447647483 | -9.95 | 17.73 | 298.33 | 299.61 |
| 72.5007721610213 | -10.41 | 17.64 | 298.75 | 299.99 |
| 72.6654998455678 | -11.15 | 17.18 | 299.47 | 300.64 |
| 72.84052301039843 | -11.87 | 16.48 | 300.42 | 301.55 |
| 73.0052506949449 | -12.91 | 15.13 | 301.92 | 303.01 |
| 73.1699783794914 | -14.52 | 13.05 | 303.8 | 304.86 |
| 73.33470606403789 | -16.54 | 10.41 | 306.01 | 307.12 |
| 73.49943374858437 | -18.76 | 7.42 | 308.63 | 309.9 |
| 73.66416143313084 | -20.49 | 4.92 | 310.52 | 311.85 |
| 73.83918459796149 | -21.9 | 2.91 | 311.22 | 312.61 |
| 74.00391228250797 | -22.99 | 1.41 | 310.9 | 312.37 |
| 74.16863996705446 | -23.88 | 0.08 | 309.95 | 311.47 |
| 74.33336765160095 | -24.72 | -1.25 | 308.04 | 309.62 |
| 74.49809533614743 | -24.79 | -1.89 | 305.2 | 306.88 |
| 74.67311850097806 | -24.72 | -2.39 | 302.19 | 303.98 |
| 74.83784618552455 | -24.47 | -2.73 | 299.01 | 300.87 |
| 75.00257387007105 | -24.73 | -3.5 | 296.28 | 298.19 |
| 75.16730155461751 | -25.1 | -4.54 | 293.63 | 295.6 |
| 75.332029239164 | -25.39 | -5.35 | 290.88 | 292.9 |
| 75.50705240399465 | -25.49 | -5.74 | 287.93 | 290.01 |
| 75.67178008854113 | -25.58 | -6.01 | 284.53 | 286.7 |
| 75.8365077730876 | -25.69 | -6.31 | 280.81 | 283.1 |
| 76.00123545763408 | -25.62 | -6.46 | 276.77 | 279.14 |
| 76.16596314218059 | -24.72 | -5.93 | 271.33 | 273.71 |
| 76.34098630701122 | -23.34 | -4.69 | 265.56 | 267.88 |
| 76.5057139915577 | -22.08 | -3.66 | 259.77 | 262.06 |
| 76.67044167610419 | -20.91 | -2.62 | 253.59 | 255.83 |
| 76.83516936065067 | -20.11 | -2.14 | 247.9 | 250.15 |
| 76.99989704519716 | -19.5 | -1.85 | 243.27 | 245.56 |
| 77.16462472974364 | -19.32 | -2.05 | 239.11 | 241.47 |
| 77.33964789457428 | -19.18 | -2.55 | 234.93 | 237.37 |
| 77.50437557912076 | -19.08 | -3.3 | 230.64 | 233.16 |
| 77.66910326366724 | -18.65 | -3.28 | 226.27 | 228.86 |
| 77.83383094821373 | -18.28 | -3.14 | 222.28 | 224.95 |
| 77.99855863276022 | -17.95 | -2.89 | 218.14 | 220.86 |
| 78.17358179759084 | -17.68 | -2.8 | 214.01 | 216.77 |
| 78.33830948213735 | -17.6 | -2.66 | 210.45 | 213.26 |
| 78.50303716668382 | -17.66 | -2.66 | 207.25 | 210.1 |
| 78.6677648512303 | -18.26 | -3.21 | 205.1 | 208.01 |
| 78.8324925357768 | -19.22 | -4.12 | 203.63 | 206.59 |
| 79.00751570060743 | -20.2 | -5.04 | 202.28 | 205.27 |
| 79.17224338515392 | -21.24 | -5.99 | 201.22 | 204.2 |
| 79.3369710697004 | -21.99 | -6.88 | 199.88 | 202.88 |
| 79.50169875424687 | -22.44 | -7.65 | 198.28 | 201.32 |
| 79.66642643879338 | -22.39 | -7.91 | 196.15 | 199.23 |
| 79.83115412333984 | -21.98 | -7.68 | 193.59 | 196.71 |
| 80.00617728817049 | -21.86 | -7.44 | 192.1 | 195.27 |
| 80.17090497271697 | -21.68 | -7.35 | 189.67 | 192.87 |
| 80.33563265726346 | -21.2 | -6.97 | 186.52 | 189.72 |
| 80.50036034180994 | -20.66 | -6.61 | 183.01 | 186.21 |
| 80.66508802635641 | -19.74 | -5.51 | 178.8 | 182.02 |
| 80.84011119118706 | -18.41 | -4.23 | 173.87 | 177.17 |
| 81.00483887573355 | -17.31 | -3.44 | 169.16 | 172.56 |
| 81.16956656028003 | -17.04 | -3.46 | 166.1 | 169.52 |
| 81.33429424482652 | -16.34 | -3.06 | 162.31 | 165.84 |
| 81.499021929373 | -15.51 | -2.53 | 158.28 | 161.94 |
| 81.67404509420363 | -14.59 | -1.73 | 154.38 | 158.19 |
| 81.83877277875014 | -14.05 | -1.24 | 151.27 | 155.16 |
| 82.00350046329662 | -13.7 | -0.9 | 148.55 | 152.48 |
| 82.1682281478431 | -13.24 | -0.39 | 146.12 | 150.06 |
| 82.33295583238957 | -12.7 | 0.25 | 143.91 | 147.84 |
| 82.50797899722022 | -12.93 | 0.08 | 143.04 | 146.97 |
| 82.67270668176671 | -13.19 | -0.18 | 142.34 | 146.28 |
| 82.83743436631318 | -13.46 | -0.57 | 141.93 | 145.88 |
| 83.00216205085967 | -13.83 | -1.11 | 141.58 | 145.54 |
| 83.16688973540616 | -14.3 | -1.79 | 141.44 | 145.4 |
| 83.33161741995264 | -14.9 | -2.49 | 141.64 | 145.55 |
| 83.50664058478327 | -15.48 | -3.22 | 142 | 145.86 |
| 83.67136826932976 | -16.18 | -4.04 | 142.8 | 146.66 |
| 83.83609595387625 | -16.95 | -4.83 | 144.07 | 147.95 |
| 84.00082363842272 | -17.74 | -5.6 | 145.54 | 149.46 |
| 84.16555132296921 | -18.69 | -6.66 | 147.2 | 151.12 |
| 84.34057448779986 | -19.73 | -7.86 | 149.1 | 153.12 |
| 84.50530217234633 | -20.63 | -8.78 | 151.39 | 155.52 |
| 84.67002985689282 | -21.41 | -9.43 | 153.86 | 158.15 |
| 84.83475754143929 | -22.52 | -10.37 | 156.95 | 161.47 |
| 84.9994852259858 | -23.92 | -11.71 | 160.37 | 165.17 |
| 85.17450839081643 | -25.36 | -13.35 | 163.69 | 168.84 |
| 85.3392360753629 | -26.34 | -14.16 | 166.34 | 171.72 |
| 85.5039637599094 | -27.15 | -14.6 | 168.86 | 174.42 |
| 85.66869144445587 | -27.84 | -14.68 | 171.16 | 176.85 |
| 85.83341912900237 | -28.23 | -14.61 | 173.24 | 178.98 |
| 85.99814681354884 | -28.45 | -14.54 | 175.16 | 180.92 |
| 86.17316997837949 | -28.59 | -14.42 | 177.01 | 182.78 |
| 86.33789766292597 | -28.88 | -14.53 | 178.68 | 184.6 |
| 86.50262534747245 | -29.12 | -14.75 | 180.1 | 186.12 |
| 86.66735303201894 | -29.56 | -15.18 | 181.9 | 188.01 |
| 86.83208071656543 | -29.91 | -15.3 | 183.65 | 189.79 |
| 87.00710388139605 | -30.08 | -15.06 | 185.29 | 191.41 |
| 87.17183156594255 | -30.01 | -14.35 | 186.69 | 192.72 |
| 87.33655925048905 | -29.97 | -13.65 | 187.98 | 193.95 |
| 87.50128693503551 | -29.76 | -12.65 | 189.03 | 195.02 |
| 87.666014619582 | -29.33 | -11.49 | 189.99 | 195.76 |
| 87.84103778441263 | -29.01 | -10.28 | 190.75 | 196.34 |
| 88.00576546895913 | -28.44 | -8.89 | 191.21 | 196.64 |
| 88.1704931535056 | -27.83 | -7.62 | 191.22 | 196.42 |
| 88.33522083805208 | -26.42 | -5.39 | 191.21 | 195.99 |
| 88.49994852259859 | -24.96 | -3.32 | 190.6 | 195.04 |
| 88.66467620714505 | -23.31 | -1.05 | 189.33 | 193.58 |
| 88.8396993719757 | -21.54 | 1.36 | 187.7 | 191.86 |
| 89.00442705652219 | -19.9 | 3.72 | 186.15 | 190.34 |
| 89.16915474106867 | -18.31 | 6.17 | 184.66 | 189.06 |
| 89.33388242561514 | -16.47 | 9.1 | 183.1 | 187.96 |
| 89.49861011016162 | -14.52 | 11.96 | 181.82 | 186.88 |
| 89.67363327499227 | -12.73 | 14.6 | 180.93 | 186.2 |
| 89.83836095953876 | -11.39 | 16.55 | 181.61 | 187.02 |
| 90.00308864408524 | -10.36 | 18.07 | 182.86 | 188.56 |
| 90.16781632863173 | -9.54 | 19.46 | 184.23 | 190.27 |
| 90.33254401317821 | -8.56 | 20.95 | 186.01 | 192.2 |
| 90.50756717800884 | -7.35 | 22.82 | 188.17 | 194.54 |
| 90.67229486255535 | -6.34 | 24.39 | 190.72 | 197.13 |
| 90.83702254710182 | -5.14 | 26.17 | 193.78 | 200.12 |
| 91.0017502316483 | -3.72 | 28.28 | 196.75 | 203.12 |
| 91.16647791619478 | -2.25 | 30.46 | 199.82 | 206.23 |
| 91.34150108102543 | -0.45 | 33.17 | 202.95 | 209.5 |
| 91.50622876557192 | 1.59 | 36.2 | 205.68 | 212.52 |
| 91.67095645011838 | 3.02 | 38.44 | 209.84 | 216.84 |
| 91.83568413466487 | 4.1 | 40.24 | 215 | 222.06 |
| 92.00041181921137 | 5.22 | 42.2 | 221.07 | 228.16 |
| 92.16513950375784 | 5.96 | 43.32 | 228.09 | 235 |
| 92.34016266858848 | 7.19 | 45.69 | 235.84 | 242.84 |
| 92.50489035313497 | 8.25 | 48.06 | 243.99 | 251.04 |
| 92.66961803768146 | 9.17 | 50.06 | 252.54 | 259.59 |
| 92.83434572222792 | 9.54 | 51.39 | 261.93 | 268.89 |
| 92.99907340677441 | 9.34 | 52.08 | 272.05 | 278.84 |
| 93.17409657160506 | 9.13 | 52.98 | 282.63 | 289.34 |
| 93.33882425615154 | 8.86 | 54.3 | 293.98 | 300.73 |
| 93.50355194069803 | 7.92 | 55.18 | 306.74 | 313.37 |
| 93.66827962524452 | 6.2 | 55.41 | 320.69 | 327.06 |
| 93.833007309791 | 4.35 | 55.56 | 335.3 | 341.41 |
| 94.00803047462163 | 2.54 | 55.55 | 350.83 | 356.61 |
| 94.17275815916813 | 0.48 | 55.21 | 366.55 | 371.98 |
| 94.3374858437146 | -1.62 | 54.94 | 382.99 | 388.14 |
| 94.5022135282611 | -3.69 | 55.07 | 400.05 | 405.01 |
| 94.66694121280757 | -5.58 | 55.69 | 417.35 | 422.15 |
| 94.83166889735405 | -7.62 | 56.25 | 435.62 | 440.14 |
| 95.0066920621847 | -9.42 | 57.22 | 453.24 | 457.62 |
| 95.17141974673117 | -10.8 | 59.06 | 469.82 | 474.3 |
| 95.33614743127767 | -12.02 | 61.39 | 485.64 | 490.31 |
| 95.50087511582414 | -13.76 | 62.82 | 502.36 | 507.13 |
| 95.66560280037064 | -14.91 | 65.06 | 517.87 | 522.84 |
| 95.84062596520126 | -16.59 | 67.13 | 534.27 | 539.41 |
| 96.00535364974776 | -18.63 | 68.73 | 551.21 | 556.47 |
| 96.17008133429425 | -20.77 | 70.24 | 568.51 | 573.87 |
| 96.33480901884072 | -22.58 | 72.38 | 585.5 | 591.02 |
| 96.49953670338721 | -24.44 | 73.86 | 602.54 | 608.15 |
| 96.67455986821784 | -26.07 | 75.27 | 618.67 | 624.36 |
| 96.83928755276433 | -27.11 | 76.9 | 631.98 | 637.84 |
| 97.00401523731081 | -28.12 | 78.03 | 645.26 | 651.2 |
| 97.1687429218573 | -29.11 | 79.07 | 658.38 | 664.36 |
| 97.3334706064038 | -30.11 | 80.4 | 671.81 | 677.88 |
| 97.49819829095026 | -31.02 | 81.58 | 684.89 | 691.02 |
| 97.67322145578092 | -31.86 | 82.7 | 697.83 | 704 |
| 97.8379491403274 | -32.2 | 84 | 709.87 | 716.11 |
| 98.00267682487387 | -32.36 | 84.96 | 720.64 | 726.92 |
| 98.16740450942035 | -32.51 | 85.83 | 730.76 | 737.08 |
| 98.33213219396683 | -32.76 | 85.98 | 739.71 | 745.98 |
| 98.50715535879748 | -33.31 | 86.51 | 748.33 | 754.62 |
| 98.67188304334397 | -34.23 | 86.7 | 757.89 | 764.18 |
| 98.83661072789045 | -34.44 | 86.47 | 766.34 | 772.6 |
| 99.00133841243694 | -34.57 | 85.83 | 774.18 | 780.36 |
| 99.16606609698341 | -34.77 | 85.19 | 781.77 | 787.87 |
| 99.34108926181405 | -35.08 | 84.59 | 789.61 | 795.6 |
| 99.50581694636055 | -35.34 | 83.49 | 797 | 802.82 |
| 99.67054463090703 | -35.56 | 81.62 | 803.71 | 809.27 |
| 99.83527231545351 | -35.9 | 79.91 | 810.74 | 816.06 |
| 100.0 | -36.46 | 78.52 | 818.42 | 823.57 |